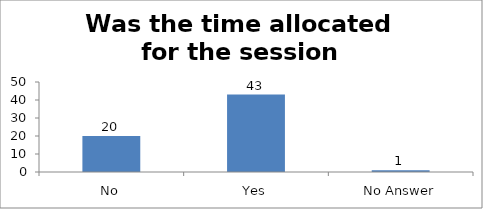
| Category | Was the time allocated for the session sufficient? |
|---|---|
| No | 20 |
| Yes | 43 |
| No Answer | 1 |